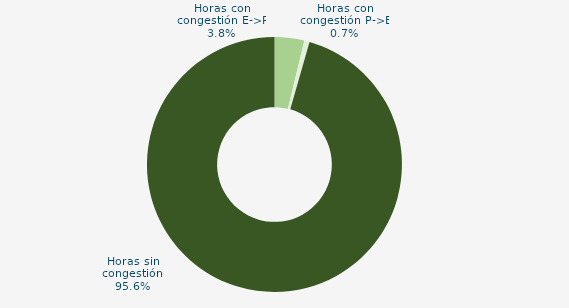
| Category | Horas con congestión E->P |
|---|---|
| Horas con congestión E->P | 3.758 |
| Horas con congestión P->E | 0.671 |
| Horas sin congestión | 95.57 |